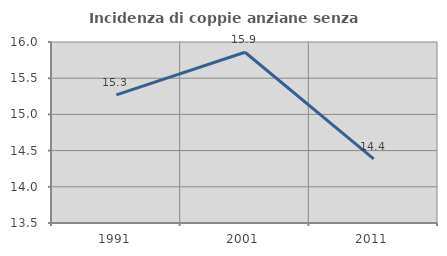
| Category | Incidenza di coppie anziane senza figli  |
|---|---|
| 1991.0 | 15.269 |
| 2001.0 | 15.859 |
| 2011.0 | 14.387 |